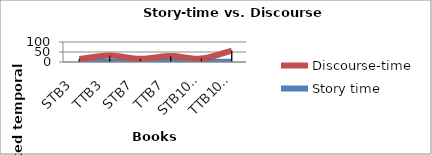
| Category | Story time | Discourse-time  |
|---|---|---|
| STB3   | 2 | 12 |
| TTB3   | 1 | 31 |
| STB7   | 2 | 14 |
| TTB7   | 2 | 28 |
| STB10   | 1 | 16 |
| TTB10   | 1 | 56 |